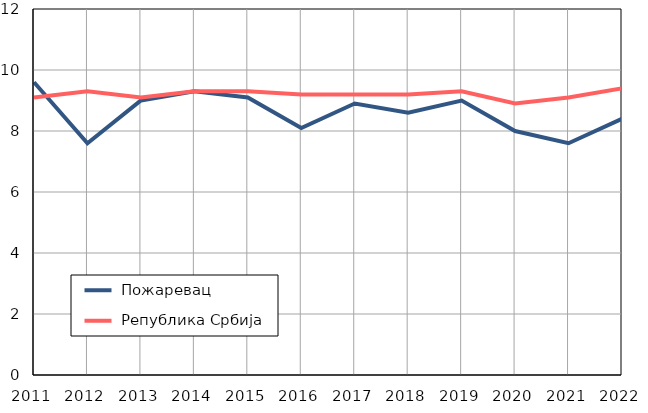
| Category |  Пожаревац |  Република Србија |
|---|---|---|
| 2011.0 | 9.6 | 9.1 |
| 2012.0 | 7.6 | 9.3 |
| 2013.0 | 9 | 9.1 |
| 2014.0 | 9.3 | 9.3 |
| 2015.0 | 9.1 | 9.3 |
| 2016.0 | 8.1 | 9.2 |
| 2017.0 | 8.9 | 9.2 |
| 2018.0 | 8.6 | 9.2 |
| 2019.0 | 9 | 9.3 |
| 2020.0 | 8 | 8.9 |
| 2021.0 | 7.6 | 9.1 |
| 2022.0 | 8.4 | 9.4 |